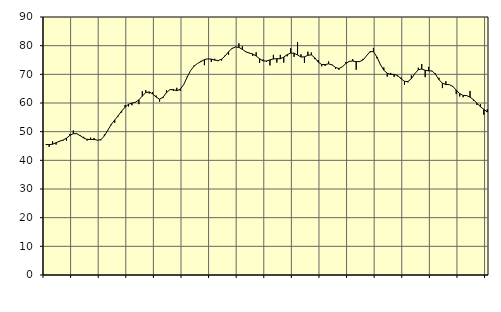
| Category | Piggar | Series 1 |
|---|---|---|
| nan | 45.5 | 45.55 |
| 87.0 | 44.7 | 45.47 |
| 87.0 | 46.6 | 45.63 |
| 87.0 | 45.5 | 46.15 |
| nan | 46.5 | 46.67 |
| 88.0 | 46.9 | 47.06 |
| 88.0 | 46.9 | 47.72 |
| 88.0 | 49.2 | 48.69 |
| nan | 50.4 | 49.32 |
| 89.0 | 49.4 | 49.28 |
| 89.0 | 48.8 | 48.59 |
| 89.0 | 48.2 | 47.78 |
| nan | 46.9 | 47.32 |
| 90.0 | 47.9 | 47.29 |
| 90.0 | 47.8 | 47.3 |
| 90.0 | 47 | 47.02 |
| nan | 47 | 47.22 |
| 91.0 | 49 | 48.52 |
| 91.0 | 50.6 | 50.51 |
| 91.0 | 52.3 | 52.54 |
| nan | 53.1 | 54.08 |
| 92.0 | 55.3 | 55.55 |
| 92.0 | 56.7 | 57.19 |
| 92.0 | 59.3 | 58.56 |
| nan | 58.8 | 59.55 |
| 93.0 | 59.2 | 60 |
| 93.0 | 60.2 | 60.27 |
| 93.0 | 59.6 | 61.09 |
| nan | 64.1 | 62.43 |
| 94.0 | 64.5 | 63.61 |
| 94.0 | 63.3 | 63.88 |
| 94.0 | 63.8 | 63.16 |
| nan | 62.6 | 62.07 |
| 95.0 | 60.5 | 61.34 |
| 95.0 | 61.7 | 62 |
| 95.0 | 64.4 | 63.6 |
| nan | 64.7 | 64.67 |
| 96.0 | 64.2 | 64.66 |
| 96.0 | 65.3 | 64.29 |
| 96.0 | 64.3 | 64.79 |
| nan | 66.5 | 66.45 |
| 97.0 | 69.2 | 69.02 |
| 97.0 | 71.3 | 71.32 |
| 97.0 | 73.1 | 72.86 |
| nan | 73.8 | 73.79 |
| 98.0 | 74.7 | 74.46 |
| 98.0 | 73.2 | 75.12 |
| 98.0 | 75.4 | 75.4 |
| nan | 74.3 | 75.31 |
| 99.0 | 75.4 | 74.95 |
| 99.0 | 74.6 | 74.82 |
| 99.0 | 74.8 | 75.31 |
| nan | 76.6 | 76.42 |
| 0.0 | 76.8 | 77.88 |
| 0.0 | 79.2 | 79.02 |
| 0.0 | 79.6 | 79.53 |
| nan | 80.8 | 79.4 |
| 1.0 | 79.8 | 78.71 |
| 1.0 | 78 | 77.85 |
| 1.0 | 77.5 | 77.41 |
| nan | 76.4 | 77.12 |
| 2.0 | 77.7 | 76.4 |
| 2.0 | 74 | 75.42 |
| 2.0 | 75.2 | 74.67 |
| nan | 74.3 | 74.66 |
| 3.0 | 73.1 | 75.03 |
| 3.0 | 76.8 | 75.36 |
| 3.0 | 74.1 | 75.46 |
| nan | 76.8 | 75.44 |
| 4.0 | 74.1 | 75.99 |
| 4.0 | 76.3 | 76.87 |
| 4.0 | 79.1 | 77.4 |
| nan | 76.1 | 77.39 |
| 5.0 | 81.2 | 76.76 |
| 5.0 | 77 | 76.04 |
| 5.0 | 74 | 76.1 |
| nan | 77.9 | 76.65 |
| 6.0 | 77.6 | 76.78 |
| 6.0 | 75.3 | 75.78 |
| 6.0 | 75 | 74.25 |
| nan | 72.8 | 73.42 |
| 7.0 | 72.9 | 73.4 |
| 7.0 | 74.5 | 73.66 |
| 7.0 | 73.4 | 73.3 |
| nan | 71.9 | 72.41 |
| 8.0 | 71.6 | 72.01 |
| 8.0 | 72.7 | 72.65 |
| 8.0 | 74.3 | 73.78 |
| nan | 74.4 | 74.53 |
| 9.0 | 75.3 | 74.63 |
| 9.0 | 71.6 | 74.42 |
| 9.0 | 74.6 | 74.44 |
| nan | 75.4 | 75.03 |
| 10.0 | 76.4 | 76.47 |
| 10.0 | 77.7 | 77.9 |
| 10.0 | 79.2 | 77.93 |
| nan | 75.6 | 76.07 |
| 11.0 | 73.6 | 73.46 |
| 11.0 | 72.4 | 71.44 |
| 11.0 | 69.2 | 70.37 |
| nan | 70.5 | 69.97 |
| 12.0 | 69.1 | 69.96 |
| 12.0 | 69.3 | 69.6 |
| 12.0 | 68.9 | 68.48 |
| nan | 66.4 | 67.55 |
| 13.0 | 67.2 | 67.49 |
| 13.0 | 69.6 | 68.48 |
| 13.0 | 70.2 | 70.24 |
| nan | 72.3 | 71.6 |
| 14.0 | 73.6 | 71.85 |
| 14.0 | 69 | 71.4 |
| 14.0 | 72.6 | 71.23 |
| nan | 71.1 | 71.17 |
| 15.0 | 70.3 | 69.99 |
| 15.0 | 68.8 | 68.14 |
| 15.0 | 65.2 | 66.89 |
| nan | 67.6 | 66.44 |
| 16.0 | 66.4 | 66.42 |
| 16.0 | 65.6 | 65.79 |
| 16.0 | 63.1 | 64.52 |
| nan | 62.3 | 63.26 |
| 17.0 | 62 | 62.63 |
| 17.0 | 62.7 | 62.58 |
| 17.0 | 64.2 | 62.07 |
| nan | 60.8 | 61.15 |
| 18.0 | 59.3 | 59.92 |
| 18.0 | 59.6 | 58.71 |
| 18.0 | 55.9 | 57.81 |
| nan | 57.8 | 56.84 |